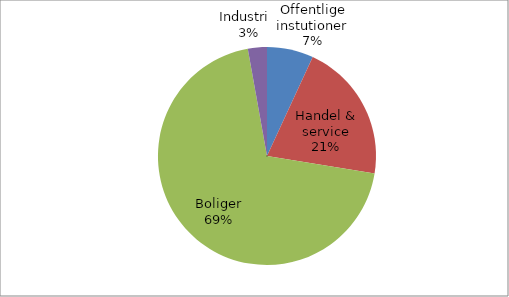
| Category | Series 0 |
|---|---|
| Offentlige instutioner | 25286.574 |
| Handel & service | 75904.588 |
| Boliger | 255409.759 |
| Industri   | 10362.932 |